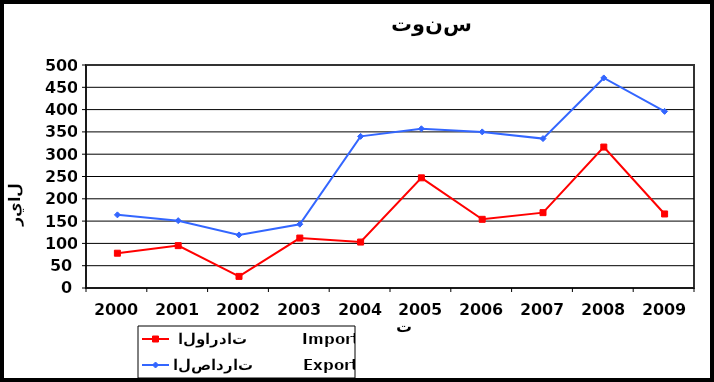
| Category |  الواردات           Import | الصادرات          Export |
|---|---|---|
| 2000.0 | 78 | 164 |
| 2001.0 | 95 | 151 |
| 2002.0 | 26 | 119 |
| 2003.0 | 112 | 143 |
| 2004.0 | 103 | 340 |
| 2005.0 | 247 | 357 |
| 2006.0 | 154 | 350 |
| 2007.0 | 169 | 335 |
| 2008.0 | 316 | 471 |
| 2009.0 | 166 | 396 |